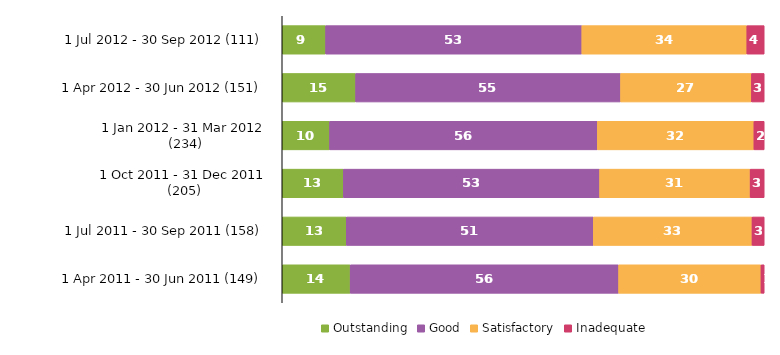
| Category | Outstanding | Good | Satisfactory | Inadequate |
|---|---|---|---|---|
| 1 Jul 2012 - 30 Sep 2012 (111) | 9.009 | 53.153 | 34.234 | 3.604 |
| 1 Apr 2012 - 30 Jun 2012 (151) | 15.232 | 54.967 | 27.152 | 2.649 |
| 1 Jan 2012 - 31 Mar 2012 (234) | 9.829 | 55.556 | 32.479 | 2.137 |
| 1 Oct 2011 - 31 Dec 2011 (205) | 12.683 | 53.171 | 31.22 | 2.927 |
| 1 Jul 2011 - 30 Sep 2011 (158) | 13.291 | 51.266 | 32.911 | 2.532 |
| 1 Apr 2011 - 30 Jun 2011 (149) | 14.094 | 55.705 | 29.53 | 0.671 |